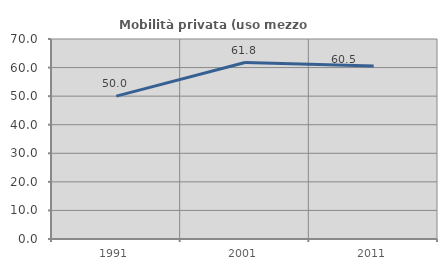
| Category | Mobilità privata (uso mezzo privato) |
|---|---|
| 1991.0 | 50 |
| 2001.0 | 61.765 |
| 2011.0 | 60.526 |